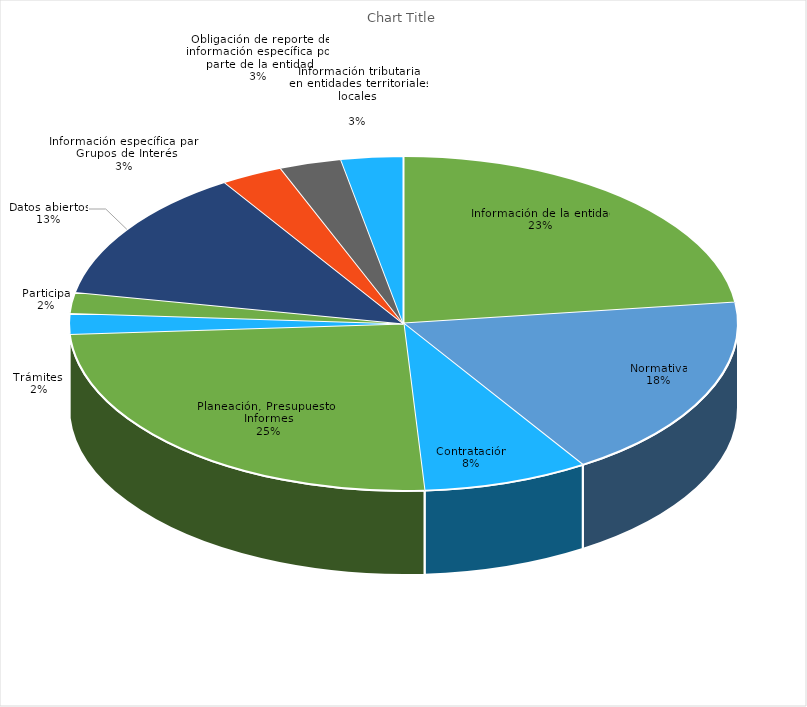
| Category | Series 0 |
|---|---|
| Información de la entidad | 0.23 |
| Normativa | 0.18 |
| Contratación | 0.08 |
| Planeación, Presupuesto e Informes | 0.25 |
| Trámites  | 0.02 |
| Participa | 0.02 |
| Datos abiertos | 0.13 |
| Información específica para Grupos de Interés | 0.03 |
| Obligación de reporte de información específica por parte de la entidad | 0.03 |
| Información tributaria
en entidades territoriales
locales
 | 0.03 |